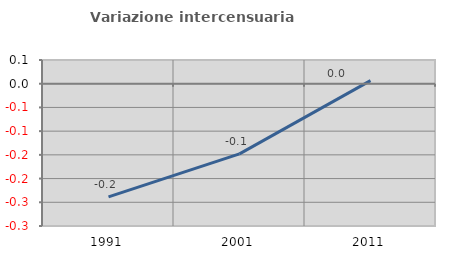
| Category | Variazione intercensuaria annua |
|---|---|
| 1991.0 | -0.238 |
| 2001.0 | -0.148 |
| 2011.0 | 0.007 |